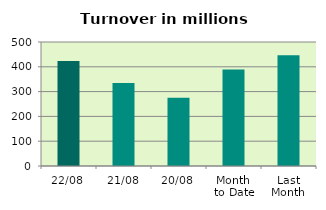
| Category | Series 0 |
|---|---|
| 22/08 | 423.425 |
| 21/08 | 334.22 |
| 20/08 | 274.859 |
| Month 
to Date | 389.416 |
| Last
Month | 446.279 |